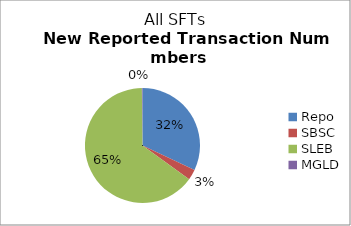
| Category | Series 0 |
|---|---|
| Repo | 437805 |
| SBSC | 40397 |
| SLEB | 887483 |
| MGLD | 2409 |